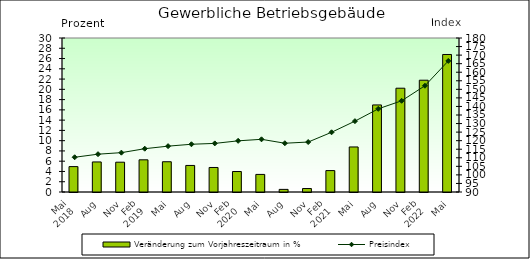
| Category | Veränderung zum Vorjahreszeitraum in % |
|---|---|
| 0 | 4.948 |
| 1 | 5.855 |
| 2 | 5.805 |
| 3 | 6.267 |
| 4 | 5.893 |
| 5 | 5.174 |
| 6 | 4.779 |
| 7 | 3.99 |
| 8 | 3.425 |
| 9 | 0.509 |
| 10 | 0.676 |
| 11 | 4.17 |
| 12 | 8.775 |
| 13 | 16.962 |
| 14 | 20.218 |
| 15 | 21.777 |
| 16 | 26.788 |